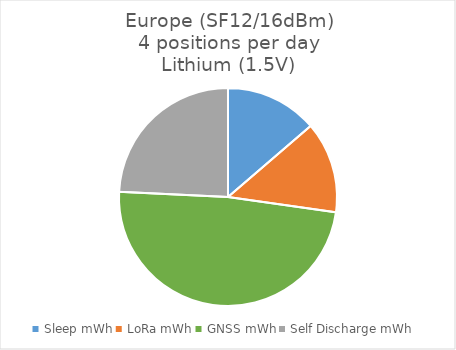
| Category | Series 0 |
|---|---|
| Sleep mWh | 0.696 |
| LoRa mWh | 0.689 |
| GNSS mWh | 2.467 |
| Self Discharge mWh | 1.233 |